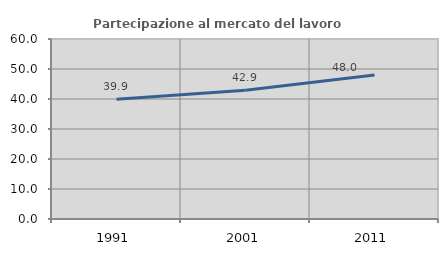
| Category | Partecipazione al mercato del lavoro  femminile |
|---|---|
| 1991.0 | 39.888 |
| 2001.0 | 42.899 |
| 2011.0 | 48.029 |